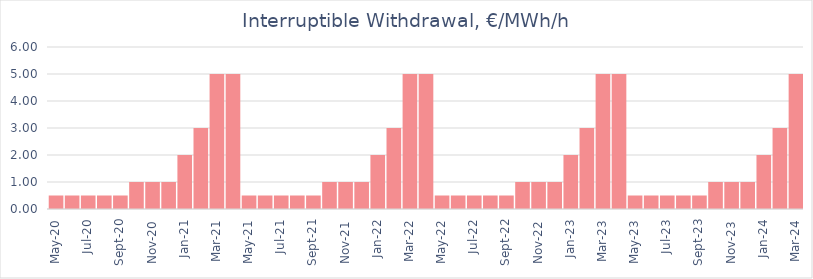
| Category | Price Pay-as-Used,  €/MWh/hour |
|---|---|
| 2020-05-01 | 0.5 |
| 2020-06-01 | 0.5 |
| 2020-07-01 | 0.5 |
| 2020-08-01 | 0.5 |
| 2020-09-01 | 0.5 |
| 2020-10-01 | 1 |
| 2020-11-01 | 1 |
| 2020-12-01 | 1 |
| 2021-01-01 | 2 |
| 2021-02-01 | 3 |
| 2021-03-01 | 5 |
| 2021-04-01 | 5 |
| 2021-05-01 | 0.5 |
| 2021-06-01 | 0.5 |
| 2021-07-01 | 0.5 |
| 2021-08-01 | 0.5 |
| 2021-09-01 | 0.5 |
| 2021-10-01 | 1 |
| 2021-11-01 | 1 |
| 2021-12-01 | 1 |
| 2022-01-01 | 2 |
| 2022-02-01 | 3 |
| 2022-03-01 | 5 |
| 2022-04-01 | 5 |
| 2022-05-01 | 0.5 |
| 2022-06-01 | 0.5 |
| 2022-07-01 | 0.5 |
| 2022-08-01 | 0.5 |
| 2022-09-01 | 0.5 |
| 2022-10-01 | 1 |
| 2022-11-01 | 1 |
| 2022-12-01 | 1 |
| 2023-01-01 | 2 |
| 2023-02-01 | 3 |
| 2023-03-01 | 5 |
| 2023-04-01 | 5 |
| 2023-05-01 | 0.5 |
| 2023-06-01 | 0.5 |
| 2023-07-01 | 0.5 |
| 2023-08-01 | 0.5 |
| 2023-09-01 | 0.5 |
| 2023-10-01 | 1 |
| 2023-11-01 | 1 |
| 2023-12-01 | 1 |
| 2024-01-01 | 2 |
| 2024-02-01 | 3 |
| 2024-03-01 | 5 |